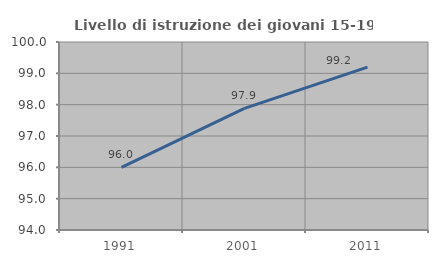
| Category | Livello di istruzione dei giovani 15-19 anni |
|---|---|
| 1991.0 | 96 |
| 2001.0 | 97.881 |
| 2011.0 | 99.2 |